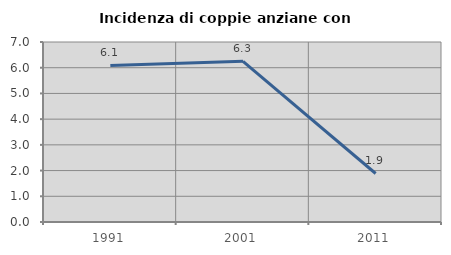
| Category | Incidenza di coppie anziane con figli |
|---|---|
| 1991.0 | 6.087 |
| 2001.0 | 6.25 |
| 2011.0 | 1.887 |